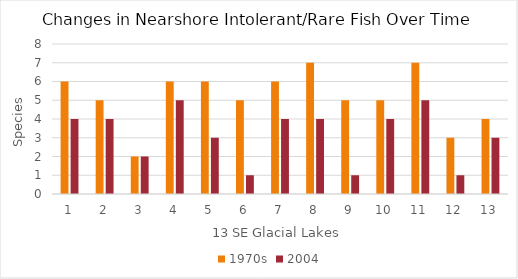
| Category | 1970s | 2004 |
|---|---|---|
| 0 | 6 | 4 |
| 1 | 5 | 4 |
| 2 | 2 | 2 |
| 3 | 6 | 5 |
| 4 | 6 | 3 |
| 5 | 5 | 1 |
| 6 | 6 | 4 |
| 7 | 7 | 4 |
| 8 | 5 | 1 |
| 9 | 5 | 4 |
| 10 | 7 | 5 |
| 11 | 3 | 1 |
| 12 | 4 | 3 |